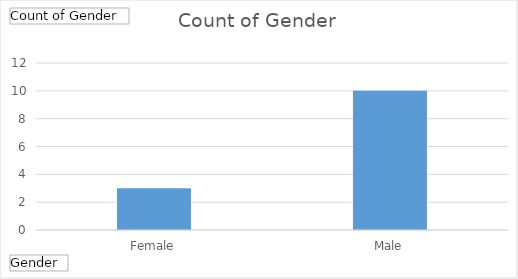
| Category | Total |
|---|---|
| Female | 3 |
| Male | 10 |